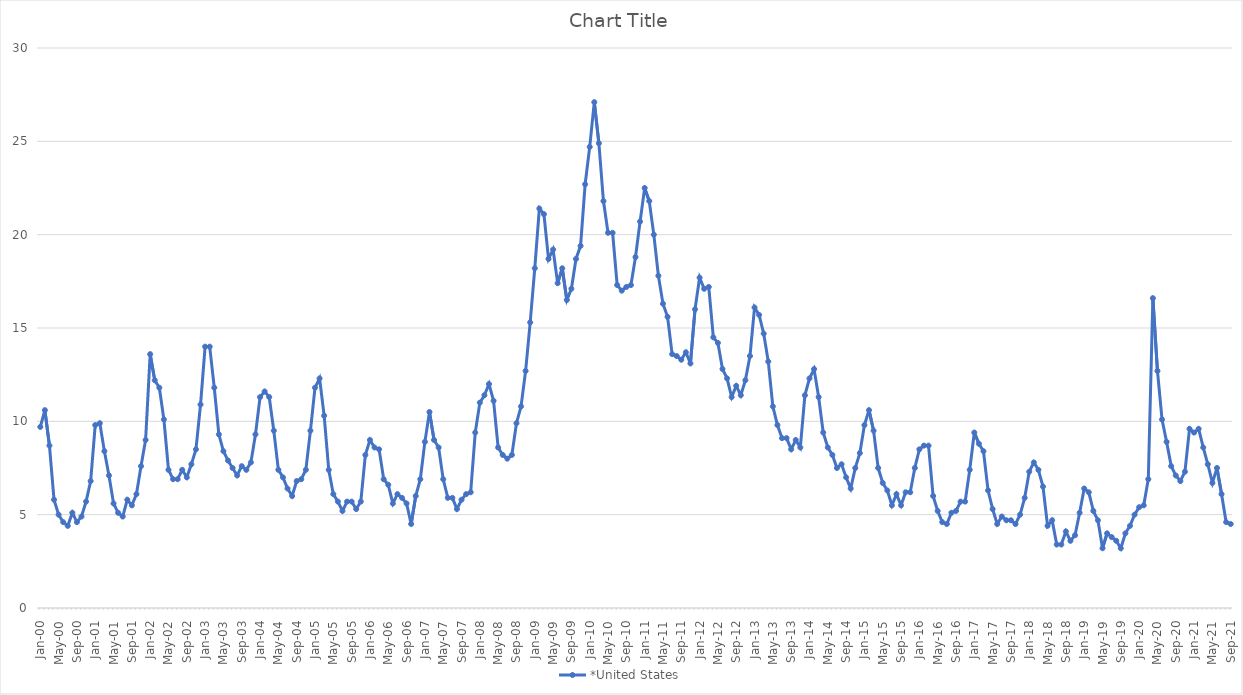
| Category | *United States | Alaska | Alabama | Arkansas | Arizona | California | Colorado | Connecticut | Delaware | Florida | Georgia | Hawaii | Iowa | Idaho | Illinois | Indiana | Kansas | Kentucky | Louisiana | Massachusetts | Maryland | Maine | Michigan | Minnesota | Missouri | Mississippi | Montana | North Carolina | North Dakota | Nebraska | New Hampshire | New Jersey | New Mexico | Nevada | New York | Ohio | Oklahoma | Oregon | Pennsylvania | Rhode Island | South Carolina | South Dakota | Tennessee | Texas | Utah | Virginia | Vermont | Washington | Wisconsin | West Virginia | Wyoming |
|---|---|---|---|---|---|---|---|---|---|---|---|---|---|---|---|---|---|---|---|---|---|---|---|---|---|---|---|---|---|---|---|---|---|---|---|---|---|---|---|---|---|---|---|---|---|---|---|---|---|---|---|
| Jan-00 | 9.7 |  |  |  |  |  |  |  |  |  |  |  |  |  |  |  |  |  |  |  |  |  |  |  |  |  |  |  |  |  |  |  |  |  |  |  |  |  |  |  |  |  |  |  |  |  |  |  |  |  |  |
| Feb-00 | 10.6 |  |  |  |  |  |  |  |  |  |  |  |  |  |  |  |  |  |  |  |  |  |  |  |  |  |  |  |  |  |  |  |  |  |  |  |  |  |  |  |  |  |  |  |  |  |  |  |  |  |  |
| Mar-00 | 8.7 |  |  |  |  |  |  |  |  |  |  |  |  |  |  |  |  |  |  |  |  |  |  |  |  |  |  |  |  |  |  |  |  |  |  |  |  |  |  |  |  |  |  |  |  |  |  |  |  |  |  |
| Apr-00 | 5.8 |  |  |  |  |  |  |  |  |  |  |  |  |  |  |  |  |  |  |  |  |  |  |  |  |  |  |  |  |  |  |  |  |  |  |  |  |  |  |  |  |  |  |  |  |  |  |  |  |  |  |
| May-00 | 5 |  |  |  |  |  |  |  |  |  |  |  |  |  |  |  |  |  |  |  |  |  |  |  |  |  |  |  |  |  |  |  |  |  |  |  |  |  |  |  |  |  |  |  |  |  |  |  |  |  |  |
| Jun-00 | 4.6 |  |  |  |  |  |  |  |  |  |  |  |  |  |  |  |  |  |  |  |  |  |  |  |  |  |  |  |  |  |  |  |  |  |  |  |  |  |  |  |  |  |  |  |  |  |  |  |  |  |  |
| Jul-00 | 4.4 |  |  |  |  |  |  |  |  |  |  |  |  |  |  |  |  |  |  |  |  |  |  |  |  |  |  |  |  |  |  |  |  |  |  |  |  |  |  |  |  |  |  |  |  |  |  |  |  |  |  |
| Aug-00 | 5.1 |  |  |  |  |  |  |  |  |  |  |  |  |  |  |  |  |  |  |  |  |  |  |  |  |  |  |  |  |  |  |  |  |  |  |  |  |  |  |  |  |  |  |  |  |  |  |  |  |  |  |
| Sep-00 | 4.6 |  |  |  |  |  |  |  |  |  |  |  |  |  |  |  |  |  |  |  |  |  |  |  |  |  |  |  |  |  |  |  |  |  |  |  |  |  |  |  |  |  |  |  |  |  |  |  |  |  |  |
| Oct-00 | 4.9 |  |  |  |  |  |  |  |  |  |  |  |  |  |  |  |  |  |  |  |  |  |  |  |  |  |  |  |  |  |  |  |  |  |  |  |  |  |  |  |  |  |  |  |  |  |  |  |  |  |  |
| Nov-00 | 5.7 |  |  |  |  |  |  |  |  |  |  |  |  |  |  |  |  |  |  |  |  |  |  |  |  |  |  |  |  |  |  |  |  |  |  |  |  |  |  |  |  |  |  |  |  |  |  |  |  |  |  |
| Dec-00 | 6.8 |  |  |  |  |  |  |  |  |  |  |  |  |  |  |  |  |  |  |  |  |  |  |  |  |  |  |  |  |  |  |  |  |  |  |  |  |  |  |  |  |  |  |  |  |  |  |  |  |  |  |
| Jan-01 | 9.8 |  |  |  |  |  |  |  |  |  |  |  |  |  |  |  |  |  |  |  |  |  |  |  |  |  |  |  |  |  |  |  |  |  |  |  |  |  |  |  |  |  |  |  |  |  |  |  |  |  |  |
| Feb-01 | 9.9 |  |  |  |  |  |  |  |  |  |  |  |  |  |  |  |  |  |  |  |  |  |  |  |  |  |  |  |  |  |  |  |  |  |  |  |  |  |  |  |  |  |  |  |  |  |  |  |  |  |  |
| Mar-01 | 8.4 |  |  |  |  |  |  |  |  |  |  |  |  |  |  |  |  |  |  |  |  |  |  |  |  |  |  |  |  |  |  |  |  |  |  |  |  |  |  |  |  |  |  |  |  |  |  |  |  |  |  |
| Apr-01 | 7.1 |  |  |  |  |  |  |  |  |  |  |  |  |  |  |  |  |  |  |  |  |  |  |  |  |  |  |  |  |  |  |  |  |  |  |  |  |  |  |  |  |  |  |  |  |  |  |  |  |  |  |
| May-01 | 5.6 |  |  |  |  |  |  |  |  |  |  |  |  |  |  |  |  |  |  |  |  |  |  |  |  |  |  |  |  |  |  |  |  |  |  |  |  |  |  |  |  |  |  |  |  |  |  |  |  |  |  |
| Jun-01 | 5.1 |  |  |  |  |  |  |  |  |  |  |  |  |  |  |  |  |  |  |  |  |  |  |  |  |  |  |  |  |  |  |  |  |  |  |  |  |  |  |  |  |  |  |  |  |  |  |  |  |  |  |
| Jul-01 | 4.9 |  |  |  |  |  |  |  |  |  |  |  |  |  |  |  |  |  |  |  |  |  |  |  |  |  |  |  |  |  |  |  |  |  |  |  |  |  |  |  |  |  |  |  |  |  |  |  |  |  |  |
| Aug-01 | 5.8 |  |  |  |  |  |  |  |  |  |  |  |  |  |  |  |  |  |  |  |  |  |  |  |  |  |  |  |  |  |  |  |  |  |  |  |  |  |  |  |  |  |  |  |  |  |  |  |  |  |  |
| Sep-01 | 5.5 |  |  |  |  |  |  |  |  |  |  |  |  |  |  |  |  |  |  |  |  |  |  |  |  |  |  |  |  |  |  |  |  |  |  |  |  |  |  |  |  |  |  |  |  |  |  |  |  |  |  |
| Oct-01 | 6.1 |  |  |  |  |  |  |  |  |  |  |  |  |  |  |  |  |  |  |  |  |  |  |  |  |  |  |  |  |  |  |  |  |  |  |  |  |  |  |  |  |  |  |  |  |  |  |  |  |  |  |
| Nov-01 | 7.6 |  |  |  |  |  |  |  |  |  |  |  |  |  |  |  |  |  |  |  |  |  |  |  |  |  |  |  |  |  |  |  |  |  |  |  |  |  |  |  |  |  |  |  |  |  |  |  |  |  |  |
| Dec-01 | 9 |  |  |  |  |  |  |  |  |  |  |  |  |  |  |  |  |  |  |  |  |  |  |  |  |  |  |  |  |  |  |  |  |  |  |  |  |  |  |  |  |  |  |  |  |  |  |  |  |  |  |
| Jan-02 | 13.6 |  |  |  |  |  |  |  |  |  |  |  |  |  |  |  |  |  |  |  |  |  |  |  |  |  |  |  |  |  |  |  |  |  |  |  |  |  |  |  |  |  |  |  |  |  |  |  |  |  |  |
| Feb-02 | 12.2 |  |  |  |  |  |  |  |  |  |  |  |  |  |  |  |  |  |  |  |  |  |  |  |  |  |  |  |  |  |  |  |  |  |  |  |  |  |  |  |  |  |  |  |  |  |  |  |  |  |  |
| Mar-02 | 11.8 |  |  |  |  |  |  |  |  |  |  |  |  |  |  |  |  |  |  |  |  |  |  |  |  |  |  |  |  |  |  |  |  |  |  |  |  |  |  |  |  |  |  |  |  |  |  |  |  |  |  |
| Apr-02 | 10.1 |  |  |  |  |  |  |  |  |  |  |  |  |  |  |  |  |  |  |  |  |  |  |  |  |  |  |  |  |  |  |  |  |  |  |  |  |  |  |  |  |  |  |  |  |  |  |  |  |  |  |
| May-02 | 7.4 |  |  |  |  |  |  |  |  |  |  |  |  |  |  |  |  |  |  |  |  |  |  |  |  |  |  |  |  |  |  |  |  |  |  |  |  |  |  |  |  |  |  |  |  |  |  |  |  |  |  |
| Jun-02 | 6.9 |  |  |  |  |  |  |  |  |  |  |  |  |  |  |  |  |  |  |  |  |  |  |  |  |  |  |  |  |  |  |  |  |  |  |  |  |  |  |  |  |  |  |  |  |  |  |  |  |  |  |
| Jul-02 | 6.9 |  |  |  |  |  |  |  |  |  |  |  |  |  |  |  |  |  |  |  |  |  |  |  |  |  |  |  |  |  |  |  |  |  |  |  |  |  |  |  |  |  |  |  |  |  |  |  |  |  |  |
| Aug-02 | 7.4 |  |  |  |  |  |  |  |  |  |  |  |  |  |  |  |  |  |  |  |  |  |  |  |  |  |  |  |  |  |  |  |  |  |  |  |  |  |  |  |  |  |  |  |  |  |  |  |  |  |  |
| Sep-02 | 7 |  |  |  |  |  |  |  |  |  |  |  |  |  |  |  |  |  |  |  |  |  |  |  |  |  |  |  |  |  |  |  |  |  |  |  |  |  |  |  |  |  |  |  |  |  |  |  |  |  |  |
| Oct-02 | 7.7 |  |  |  |  |  |  |  |  |  |  |  |  |  |  |  |  |  |  |  |  |  |  |  |  |  |  |  |  |  |  |  |  |  |  |  |  |  |  |  |  |  |  |  |  |  |  |  |  |  |  |
| Nov-02 | 8.5 |  |  |  |  |  |  |  |  |  |  |  |  |  |  |  |  |  |  |  |  |  |  |  |  |  |  |  |  |  |  |  |  |  |  |  |  |  |  |  |  |  |  |  |  |  |  |  |  |  |  |
| Dec-02 | 10.9 |  |  |  |  |  |  |  |  |  |  |  |  |  |  |  |  |  |  |  |  |  |  |  |  |  |  |  |  |  |  |  |  |  |  |  |  |  |  |  |  |  |  |  |  |  |  |  |  |  |  |
| Jan-03 | 14 |  |  |  |  |  |  |  |  |  |  |  |  |  |  |  |  |  |  |  |  |  |  |  |  |  |  |  |  |  |  |  |  |  |  |  |  |  |  |  |  |  |  |  |  |  |  |  |  |  |  |
| Feb-03 | 14 |  |  |  |  |  |  |  |  |  |  |  |  |  |  |  |  |  |  |  |  |  |  |  |  |  |  |  |  |  |  |  |  |  |  |  |  |  |  |  |  |  |  |  |  |  |  |  |  |  |  |
| Mar-03 | 11.8 |  |  |  |  |  |  |  |  |  |  |  |  |  |  |  |  |  |  |  |  |  |  |  |  |  |  |  |  |  |  |  |  |  |  |  |  |  |  |  |  |  |  |  |  |  |  |  |  |  |  |
| Apr-03 | 9.3 |  |  |  |  |  |  |  |  |  |  |  |  |  |  |  |  |  |  |  |  |  |  |  |  |  |  |  |  |  |  |  |  |  |  |  |  |  |  |  |  |  |  |  |  |  |  |  |  |  |  |
| May-03 | 8.4 |  |  |  |  |  |  |  |  |  |  |  |  |  |  |  |  |  |  |  |  |  |  |  |  |  |  |  |  |  |  |  |  |  |  |  |  |  |  |  |  |  |  |  |  |  |  |  |  |  |  |
| Jun-03 | 7.9 |  |  |  |  |  |  |  |  |  |  |  |  |  |  |  |  |  |  |  |  |  |  |  |  |  |  |  |  |  |  |  |  |  |  |  |  |  |  |  |  |  |  |  |  |  |  |  |  |  |  |
| Jul-03 | 7.5 |  |  |  |  |  |  |  |  |  |  |  |  |  |  |  |  |  |  |  |  |  |  |  |  |  |  |  |  |  |  |  |  |  |  |  |  |  |  |  |  |  |  |  |  |  |  |  |  |  |  |
| Aug-03 | 7.1 |  |  |  |  |  |  |  |  |  |  |  |  |  |  |  |  |  |  |  |  |  |  |  |  |  |  |  |  |  |  |  |  |  |  |  |  |  |  |  |  |  |  |  |  |  |  |  |  |  |  |
| Sep-03 | 7.6 |  |  |  |  |  |  |  |  |  |  |  |  |  |  |  |  |  |  |  |  |  |  |  |  |  |  |  |  |  |  |  |  |  |  |  |  |  |  |  |  |  |  |  |  |  |  |  |  |  |  |
| Oct-03 | 7.4 |  |  |  |  |  |  |  |  |  |  |  |  |  |  |  |  |  |  |  |  |  |  |  |  |  |  |  |  |  |  |  |  |  |  |  |  |  |  |  |  |  |  |  |  |  |  |  |  |  |  |
| Nov-03 | 7.8 |  |  |  |  |  |  |  |  |  |  |  |  |  |  |  |  |  |  |  |  |  |  |  |  |  |  |  |  |  |  |  |  |  |  |  |  |  |  |  |  |  |  |  |  |  |  |  |  |  |  |
| Dec-03 | 9.3 |  |  |  |  |  |  |  |  |  |  |  |  |  |  |  |  |  |  |  |  |  |  |  |  |  |  |  |  |  |  |  |  |  |  |  |  |  |  |  |  |  |  |  |  |  |  |  |  |  |  |
| Jan-04 | 11.3 |  |  |  |  |  |  |  |  |  |  |  |  |  |  |  |  |  |  |  |  |  |  |  |  |  |  |  |  |  |  |  |  |  |  |  |  |  |  |  |  |  |  |  |  |  |  |  |  |  |  |
| Feb-04 | 11.6 |  |  |  |  |  |  |  |  |  |  |  |  |  |  |  |  |  |  |  |  |  |  |  |  |  |  |  |  |  |  |  |  |  |  |  |  |  |  |  |  |  |  |  |  |  |  |  |  |  |  |
| Mar-04 | 11.3 |  |  |  |  |  |  |  |  |  |  |  |  |  |  |  |  |  |  |  |  |  |  |  |  |  |  |  |  |  |  |  |  |  |  |  |  |  |  |  |  |  |  |  |  |  |  |  |  |  |  |
| Apr-04 | 9.5 |  |  |  |  |  |  |  |  |  |  |  |  |  |  |  |  |  |  |  |  |  |  |  |  |  |  |  |  |  |  |  |  |  |  |  |  |  |  |  |  |  |  |  |  |  |  |  |  |  |  |
| May-04 | 7.4 |  |  |  |  |  |  |  |  |  |  |  |  |  |  |  |  |  |  |  |  |  |  |  |  |  |  |  |  |  |  |  |  |  |  |  |  |  |  |  |  |  |  |  |  |  |  |  |  |  |  |
| Jun-04 | 7 |  |  |  |  |  |  |  |  |  |  |  |  |  |  |  |  |  |  |  |  |  |  |  |  |  |  |  |  |  |  |  |  |  |  |  |  |  |  |  |  |  |  |  |  |  |  |  |  |  |  |
| Jul-04 | 6.4 |  |  |  |  |  |  |  |  |  |  |  |  |  |  |  |  |  |  |  |  |  |  |  |  |  |  |  |  |  |  |  |  |  |  |  |  |  |  |  |  |  |  |  |  |  |  |  |  |  |  |
| Aug-04 | 6 |  |  |  |  |  |  |  |  |  |  |  |  |  |  |  |  |  |  |  |  |  |  |  |  |  |  |  |  |  |  |  |  |  |  |  |  |  |  |  |  |  |  |  |  |  |  |  |  |  |  |
| Sep-04 | 6.8 |  |  |  |  |  |  |  |  |  |  |  |  |  |  |  |  |  |  |  |  |  |  |  |  |  |  |  |  |  |  |  |  |  |  |  |  |  |  |  |  |  |  |  |  |  |  |  |  |  |  |
| Oct-04 | 6.9 |  |  |  |  |  |  |  |  |  |  |  |  |  |  |  |  |  |  |  |  |  |  |  |  |  |  |  |  |  |  |  |  |  |  |  |  |  |  |  |  |  |  |  |  |  |  |  |  |  |  |
| Nov-04 | 7.4 |  |  |  |  |  |  |  |  |  |  |  |  |  |  |  |  |  |  |  |  |  |  |  |  |  |  |  |  |  |  |  |  |  |  |  |  |  |  |  |  |  |  |  |  |  |  |  |  |  |  |
| Dec-04 | 9.5 |  |  |  |  |  |  |  |  |  |  |  |  |  |  |  |  |  |  |  |  |  |  |  |  |  |  |  |  |  |  |  |  |  |  |  |  |  |  |  |  |  |  |  |  |  |  |  |  |  |  |
| Jan-05 | 11.8 |  |  |  |  |  |  |  |  |  |  |  |  |  |  |  |  |  |  |  |  |  |  |  |  |  |  |  |  |  |  |  |  |  |  |  |  |  |  |  |  |  |  |  |  |  |  |  |  |  |  |
| Feb-05 | 12.3 |  |  |  |  |  |  |  |  |  |  |  |  |  |  |  |  |  |  |  |  |  |  |  |  |  |  |  |  |  |  |  |  |  |  |  |  |  |  |  |  |  |  |  |  |  |  |  |  |  |  |
| Mar-05 | 10.3 |  |  |  |  |  |  |  |  |  |  |  |  |  |  |  |  |  |  |  |  |  |  |  |  |  |  |  |  |  |  |  |  |  |  |  |  |  |  |  |  |  |  |  |  |  |  |  |  |  |  |
| Apr-05 | 7.4 |  |  |  |  |  |  |  |  |  |  |  |  |  |  |  |  |  |  |  |  |  |  |  |  |  |  |  |  |  |  |  |  |  |  |  |  |  |  |  |  |  |  |  |  |  |  |  |  |  |  |
| May-05 | 6.1 |  |  |  |  |  |  |  |  |  |  |  |  |  |  |  |  |  |  |  |  |  |  |  |  |  |  |  |  |  |  |  |  |  |  |  |  |  |  |  |  |  |  |  |  |  |  |  |  |  |  |
| Jun-05 | 5.7 |  |  |  |  |  |  |  |  |  |  |  |  |  |  |  |  |  |  |  |  |  |  |  |  |  |  |  |  |  |  |  |  |  |  |  |  |  |  |  |  |  |  |  |  |  |  |  |  |  |  |
| Jul-05 | 5.2 |  |  |  |  |  |  |  |  |  |  |  |  |  |  |  |  |  |  |  |  |  |  |  |  |  |  |  |  |  |  |  |  |  |  |  |  |  |  |  |  |  |  |  |  |  |  |  |  |  |  |
| Aug-05 | 5.7 |  |  |  |  |  |  |  |  |  |  |  |  |  |  |  |  |  |  |  |  |  |  |  |  |  |  |  |  |  |  |  |  |  |  |  |  |  |  |  |  |  |  |  |  |  |  |  |  |  |  |
| Sep-05 | 5.7 |  |  |  |  |  |  |  |  |  |  |  |  |  |  |  |  |  |  |  |  |  |  |  |  |  |  |  |  |  |  |  |  |  |  |  |  |  |  |  |  |  |  |  |  |  |  |  |  |  |  |
| Oct-05 | 5.3 |  |  |  |  |  |  |  |  |  |  |  |  |  |  |  |  |  |  |  |  |  |  |  |  |  |  |  |  |  |  |  |  |  |  |  |  |  |  |  |  |  |  |  |  |  |  |  |  |  |  |
| Nov-05 | 5.7 |  |  |  |  |  |  |  |  |  |  |  |  |  |  |  |  |  |  |  |  |  |  |  |  |  |  |  |  |  |  |  |  |  |  |  |  |  |  |  |  |  |  |  |  |  |  |  |  |  |  |
| Dec-05 | 8.2 |  |  |  |  |  |  |  |  |  |  |  |  |  |  |  |  |  |  |  |  |  |  |  |  |  |  |  |  |  |  |  |  |  |  |  |  |  |  |  |  |  |  |  |  |  |  |  |  |  |  |
| Jan-06 | 9 |  |  |  |  |  |  |  |  |  |  |  |  |  |  |  |  |  |  |  |  |  |  |  |  |  |  |  |  |  |  |  |  |  |  |  |  |  |  |  |  |  |  |  |  |  |  |  |  |  |  |
| Feb-06 | 8.6 |  |  |  |  |  |  |  |  |  |  |  |  |  |  |  |  |  |  |  |  |  |  |  |  |  |  |  |  |  |  |  |  |  |  |  |  |  |  |  |  |  |  |  |  |  |  |  |  |  |  |
| Mar-06 | 8.5 |  |  |  |  |  |  |  |  |  |  |  |  |  |  |  |  |  |  |  |  |  |  |  |  |  |  |  |  |  |  |  |  |  |  |  |  |  |  |  |  |  |  |  |  |  |  |  |  |  |  |
| Apr-06 | 6.9 |  |  |  |  |  |  |  |  |  |  |  |  |  |  |  |  |  |  |  |  |  |  |  |  |  |  |  |  |  |  |  |  |  |  |  |  |  |  |  |  |  |  |  |  |  |  |  |  |  |  |
| May-06 | 6.6 |  |  |  |  |  |  |  |  |  |  |  |  |  |  |  |  |  |  |  |  |  |  |  |  |  |  |  |  |  |  |  |  |  |  |  |  |  |  |  |  |  |  |  |  |  |  |  |  |  |  |
| Jun-06 | 5.6 |  |  |  |  |  |  |  |  |  |  |  |  |  |  |  |  |  |  |  |  |  |  |  |  |  |  |  |  |  |  |  |  |  |  |  |  |  |  |  |  |  |  |  |  |  |  |  |  |  |  |
| Jul-06 | 6.1 |  |  |  |  |  |  |  |  |  |  |  |  |  |  |  |  |  |  |  |  |  |  |  |  |  |  |  |  |  |  |  |  |  |  |  |  |  |  |  |  |  |  |  |  |  |  |  |  |  |  |
| Aug-06 | 5.9 |  |  |  |  |  |  |  |  |  |  |  |  |  |  |  |  |  |  |  |  |  |  |  |  |  |  |  |  |  |  |  |  |  |  |  |  |  |  |  |  |  |  |  |  |  |  |  |  |  |  |
| Sep-06 | 5.6 |  |  |  |  |  |  |  |  |  |  |  |  |  |  |  |  |  |  |  |  |  |  |  |  |  |  |  |  |  |  |  |  |  |  |  |  |  |  |  |  |  |  |  |  |  |  |  |  |  |  |
| Oct-06 | 4.5 |  |  |  |  |  |  |  |  |  |  |  |  |  |  |  |  |  |  |  |  |  |  |  |  |  |  |  |  |  |  |  |  |  |  |  |  |  |  |  |  |  |  |  |  |  |  |  |  |  |  |
| Nov-06 | 6 |  |  |  |  |  |  |  |  |  |  |  |  |  |  |  |  |  |  |  |  |  |  |  |  |  |  |  |  |  |  |  |  |  |  |  |  |  |  |  |  |  |  |  |  |  |  |  |  |  |  |
| Dec-06 | 6.9 |  |  |  |  |  |  |  |  |  |  |  |  |  |  |  |  |  |  |  |  |  |  |  |  |  |  |  |  |  |  |  |  |  |  |  |  |  |  |  |  |  |  |  |  |  |  |  |  |  |  |
| Jan-07 | 8.9 |  |  |  |  |  |  |  |  |  |  |  |  |  |  |  |  |  |  |  |  |  |  |  |  |  |  |  |  |  |  |  |  |  |  |  |  |  |  |  |  |  |  |  |  |  |  |  |  |  |  |
| Feb-07 | 10.5 |  |  |  |  |  |  |  |  |  |  |  |  |  |  |  |  |  |  |  |  |  |  |  |  |  |  |  |  |  |  |  |  |  |  |  |  |  |  |  |  |  |  |  |  |  |  |  |  |  |  |
| Mar-07 | 9 |  |  |  |  |  |  |  |  |  |  |  |  |  |  |  |  |  |  |  |  |  |  |  |  |  |  |  |  |  |  |  |  |  |  |  |  |  |  |  |  |  |  |  |  |  |  |  |  |  |  |
| Apr-07 | 8.6 |  |  |  |  |  |  |  |  |  |  |  |  |  |  |  |  |  |  |  |  |  |  |  |  |  |  |  |  |  |  |  |  |  |  |  |  |  |  |  |  |  |  |  |  |  |  |  |  |  |  |
| May-07 | 6.9 |  |  |  |  |  |  |  |  |  |  |  |  |  |  |  |  |  |  |  |  |  |  |  |  |  |  |  |  |  |  |  |  |  |  |  |  |  |  |  |  |  |  |  |  |  |  |  |  |  |  |
| Jun-07 | 5.9 |  |  |  |  |  |  |  |  |  |  |  |  |  |  |  |  |  |  |  |  |  |  |  |  |  |  |  |  |  |  |  |  |  |  |  |  |  |  |  |  |  |  |  |  |  |  |  |  |  |  |
| Jul-07 | 5.9 |  |  |  |  |  |  |  |  |  |  |  |  |  |  |  |  |  |  |  |  |  |  |  |  |  |  |  |  |  |  |  |  |  |  |  |  |  |  |  |  |  |  |  |  |  |  |  |  |  |  |
| Aug-07 | 5.3 |  |  |  |  |  |  |  |  |  |  |  |  |  |  |  |  |  |  |  |  |  |  |  |  |  |  |  |  |  |  |  |  |  |  |  |  |  |  |  |  |  |  |  |  |  |  |  |  |  |  |
| Sep-07 | 5.8 |  |  |  |  |  |  |  |  |  |  |  |  |  |  |  |  |  |  |  |  |  |  |  |  |  |  |  |  |  |  |  |  |  |  |  |  |  |  |  |  |  |  |  |  |  |  |  |  |  |  |
| Oct-07 | 6.1 |  |  |  |  |  |  |  |  |  |  |  |  |  |  |  |  |  |  |  |  |  |  |  |  |  |  |  |  |  |  |  |  |  |  |  |  |  |  |  |  |  |  |  |  |  |  |  |  |  |  |
| Nov-07 | 6.2 |  |  |  |  |  |  |  |  |  |  |  |  |  |  |  |  |  |  |  |  |  |  |  |  |  |  |  |  |  |  |  |  |  |  |  |  |  |  |  |  |  |  |  |  |  |  |  |  |  |  |
| Dec-07 | 9.4 |  |  |  |  |  |  |  |  |  |  |  |  |  |  |  |  |  |  |  |  |  |  |  |  |  |  |  |  |  |  |  |  |  |  |  |  |  |  |  |  |  |  |  |  |  |  |  |  |  |  |
| Jan-08 | 11 |  |  |  |  |  |  |  |  |  |  |  |  |  |  |  |  |  |  |  |  |  |  |  |  |  |  |  |  |  |  |  |  |  |  |  |  |  |  |  |  |  |  |  |  |  |  |  |  |  |  |
| Feb-08 | 11.4 |  |  |  |  |  |  |  |  |  |  |  |  |  |  |  |  |  |  |  |  |  |  |  |  |  |  |  |  |  |  |  |  |  |  |  |  |  |  |  |  |  |  |  |  |  |  |  |  |  |  |
| Mar-08 | 12 |  |  |  |  |  |  |  |  |  |  |  |  |  |  |  |  |  |  |  |  |  |  |  |  |  |  |  |  |  |  |  |  |  |  |  |  |  |  |  |  |  |  |  |  |  |  |  |  |  |  |
| Apr-08 | 11.1 |  |  |  |  |  |  |  |  |  |  |  |  |  |  |  |  |  |  |  |  |  |  |  |  |  |  |  |  |  |  |  |  |  |  |  |  |  |  |  |  |  |  |  |  |  |  |  |  |  |  |
| May-08 | 8.6 |  |  |  |  |  |  |  |  |  |  |  |  |  |  |  |  |  |  |  |  |  |  |  |  |  |  |  |  |  |  |  |  |  |  |  |  |  |  |  |  |  |  |  |  |  |  |  |  |  |  |
| Jun-08 | 8.2 |  |  |  |  |  |  |  |  |  |  |  |  |  |  |  |  |  |  |  |  |  |  |  |  |  |  |  |  |  |  |  |  |  |  |  |  |  |  |  |  |  |  |  |  |  |  |  |  |  |  |
| Jul-08 | 8 |  |  |  |  |  |  |  |  |  |  |  |  |  |  |  |  |  |  |  |  |  |  |  |  |  |  |  |  |  |  |  |  |  |  |  |  |  |  |  |  |  |  |  |  |  |  |  |  |  |  |
| Aug-08 | 8.2 |  |  |  |  |  |  |  |  |  |  |  |  |  |  |  |  |  |  |  |  |  |  |  |  |  |  |  |  |  |  |  |  |  |  |  |  |  |  |  |  |  |  |  |  |  |  |  |  |  |  |
| Sep-08 | 9.9 |  |  |  |  |  |  |  |  |  |  |  |  |  |  |  |  |  |  |  |  |  |  |  |  |  |  |  |  |  |  |  |  |  |  |  |  |  |  |  |  |  |  |  |  |  |  |  |  |  |  |
| Oct-08 | 10.8 |  |  |  |  |  |  |  |  |  |  |  |  |  |  |  |  |  |  |  |  |  |  |  |  |  |  |  |  |  |  |  |  |  |  |  |  |  |  |  |  |  |  |  |  |  |  |  |  |  |  |
| Nov-08 | 12.7 |  |  |  |  |  |  |  |  |  |  |  |  |  |  |  |  |  |  |  |  |  |  |  |  |  |  |  |  |  |  |  |  |  |  |  |  |  |  |  |  |  |  |  |  |  |  |  |  |  |  |
| Dec-08 | 15.3 |  |  |  |  |  |  |  |  |  |  |  |  |  |  |  |  |  |  |  |  |  |  |  |  |  |  |  |  |  |  |  |  |  |  |  |  |  |  |  |  |  |  |  |  |  |  |  |  |  |  |
| Jan-09 | 18.2 |  |  |  |  |  |  |  |  |  |  |  |  |  |  |  |  |  |  |  |  |  |  |  |  |  |  |  |  |  |  |  |  |  |  |  |  |  |  |  |  |  |  |  |  |  |  |  |  |  |  |
| Feb-09 | 21.4 |  |  |  |  |  |  |  |  |  |  |  |  |  |  |  |  |  |  |  |  |  |  |  |  |  |  |  |  |  |  |  |  |  |  |  |  |  |  |  |  |  |  |  |  |  |  |  |  |  |  |
| Mar-09 | 21.1 |  |  |  |  |  |  |  |  |  |  |  |  |  |  |  |  |  |  |  |  |  |  |  |  |  |  |  |  |  |  |  |  |  |  |  |  |  |  |  |  |  |  |  |  |  |  |  |  |  |  |
| Apr-09 | 18.7 |  |  |  |  |  |  |  |  |  |  |  |  |  |  |  |  |  |  |  |  |  |  |  |  |  |  |  |  |  |  |  |  |  |  |  |  |  |  |  |  |  |  |  |  |  |  |  |  |  |  |
| May-09 | 19.2 |  |  |  |  |  |  |  |  |  |  |  |  |  |  |  |  |  |  |  |  |  |  |  |  |  |  |  |  |  |  |  |  |  |  |  |  |  |  |  |  |  |  |  |  |  |  |  |  |  |  |
| Jun-09 | 17.4 |  |  |  |  |  |  |  |  |  |  |  |  |  |  |  |  |  |  |  |  |  |  |  |  |  |  |  |  |  |  |  |  |  |  |  |  |  |  |  |  |  |  |  |  |  |  |  |  |  |  |
| Jul-09 | 18.2 |  |  |  |  |  |  |  |  |  |  |  |  |  |  |  |  |  |  |  |  |  |  |  |  |  |  |  |  |  |  |  |  |  |  |  |  |  |  |  |  |  |  |  |  |  |  |  |  |  |  |
| Aug-09 | 16.5 |  |  |  |  |  |  |  |  |  |  |  |  |  |  |  |  |  |  |  |  |  |  |  |  |  |  |  |  |  |  |  |  |  |  |  |  |  |  |  |  |  |  |  |  |  |  |  |  |  |  |
| Sep-09 | 17.1 |  |  |  |  |  |  |  |  |  |  |  |  |  |  |  |  |  |  |  |  |  |  |  |  |  |  |  |  |  |  |  |  |  |  |  |  |  |  |  |  |  |  |  |  |  |  |  |  |  |  |
| Oct-09 | 18.7 |  |  |  |  |  |  |  |  |  |  |  |  |  |  |  |  |  |  |  |  |  |  |  |  |  |  |  |  |  |  |  |  |  |  |  |  |  |  |  |  |  |  |  |  |  |  |  |  |  |  |
| Nov-09 | 19.4 |  |  |  |  |  |  |  |  |  |  |  |  |  |  |  |  |  |  |  |  |  |  |  |  |  |  |  |  |  |  |  |  |  |  |  |  |  |  |  |  |  |  |  |  |  |  |  |  |  |  |
| Dec-09 | 22.7 |  |  |  |  |  |  |  |  |  |  |  |  |  |  |  |  |  |  |  |  |  |  |  |  |  |  |  |  |  |  |  |  |  |  |  |  |  |  |  |  |  |  |  |  |  |  |  |  |  |  |
| Jan-10 | 24.7 |  |  |  |  |  |  |  |  |  |  |  |  |  |  |  |  |  |  |  |  |  |  |  |  |  |  |  |  |  |  |  |  |  |  |  |  |  |  |  |  |  |  |  |  |  |  |  |  |  |  |
| Feb-10 | 27.1 |  |  |  |  |  |  |  |  |  |  |  |  |  |  |  |  |  |  |  |  |  |  |  |  |  |  |  |  |  |  |  |  |  |  |  |  |  |  |  |  |  |  |  |  |  |  |  |  |  |  |
| Mar-10 | 24.9 |  |  |  |  |  |  |  |  |  |  |  |  |  |  |  |  |  |  |  |  |  |  |  |  |  |  |  |  |  |  |  |  |  |  |  |  |  |  |  |  |  |  |  |  |  |  |  |  |  |  |
| Apr-10 | 21.8 |  |  |  |  |  |  |  |  |  |  |  |  |  |  |  |  |  |  |  |  |  |  |  |  |  |  |  |  |  |  |  |  |  |  |  |  |  |  |  |  |  |  |  |  |  |  |  |  |  |  |
| May-10 | 20.1 |  |  |  |  |  |  |  |  |  |  |  |  |  |  |  |  |  |  |  |  |  |  |  |  |  |  |  |  |  |  |  |  |  |  |  |  |  |  |  |  |  |  |  |  |  |  |  |  |  |  |
| Jun-10 | 20.1 |  |  |  |  |  |  |  |  |  |  |  |  |  |  |  |  |  |  |  |  |  |  |  |  |  |  |  |  |  |  |  |  |  |  |  |  |  |  |  |  |  |  |  |  |  |  |  |  |  |  |
| Jul-10 | 17.3 |  |  |  |  |  |  |  |  |  |  |  |  |  |  |  |  |  |  |  |  |  |  |  |  |  |  |  |  |  |  |  |  |  |  |  |  |  |  |  |  |  |  |  |  |  |  |  |  |  |  |
| Aug-10 | 17 |  |  |  |  |  |  |  |  |  |  |  |  |  |  |  |  |  |  |  |  |  |  |  |  |  |  |  |  |  |  |  |  |  |  |  |  |  |  |  |  |  |  |  |  |  |  |  |  |  |  |
| Sep-10 | 17.2 |  |  |  |  |  |  |  |  |  |  |  |  |  |  |  |  |  |  |  |  |  |  |  |  |  |  |  |  |  |  |  |  |  |  |  |  |  |  |  |  |  |  |  |  |  |  |  |  |  |  |
| Oct-10 | 17.3 |  |  |  |  |  |  |  |  |  |  |  |  |  |  |  |  |  |  |  |  |  |  |  |  |  |  |  |  |  |  |  |  |  |  |  |  |  |  |  |  |  |  |  |  |  |  |  |  |  |  |
| Nov-10 | 18.8 |  |  |  |  |  |  |  |  |  |  |  |  |  |  |  |  |  |  |  |  |  |  |  |  |  |  |  |  |  |  |  |  |  |  |  |  |  |  |  |  |  |  |  |  |  |  |  |  |  |  |
| Dec-10 | 20.7 |  |  |  |  |  |  |  |  |  |  |  |  |  |  |  |  |  |  |  |  |  |  |  |  |  |  |  |  |  |  |  |  |  |  |  |  |  |  |  |  |  |  |  |  |  |  |  |  |  |  |
| Jan-11 | 22.5 |  |  |  |  |  |  |  |  |  |  |  |  |  |  |  |  |  |  |  |  |  |  |  |  |  |  |  |  |  |  |  |  |  |  |  |  |  |  |  |  |  |  |  |  |  |  |  |  |  |  |
| Feb-11 | 21.8 |  |  |  |  |  |  |  |  |  |  |  |  |  |  |  |  |  |  |  |  |  |  |  |  |  |  |  |  |  |  |  |  |  |  |  |  |  |  |  |  |  |  |  |  |  |  |  |  |  |  |
| Mar-11 | 20 |  |  |  |  |  |  |  |  |  |  |  |  |  |  |  |  |  |  |  |  |  |  |  |  |  |  |  |  |  |  |  |  |  |  |  |  |  |  |  |  |  |  |  |  |  |  |  |  |  |  |
| Apr-11 | 17.8 |  |  |  |  |  |  |  |  |  |  |  |  |  |  |  |  |  |  |  |  |  |  |  |  |  |  |  |  |  |  |  |  |  |  |  |  |  |  |  |  |  |  |  |  |  |  |  |  |  |  |
| May-11 | 16.3 |  |  |  |  |  |  |  |  |  |  |  |  |  |  |  |  |  |  |  |  |  |  |  |  |  |  |  |  |  |  |  |  |  |  |  |  |  |  |  |  |  |  |  |  |  |  |  |  |  |  |
| Jun-11 | 15.6 |  |  |  |  |  |  |  |  |  |  |  |  |  |  |  |  |  |  |  |  |  |  |  |  |  |  |  |  |  |  |  |  |  |  |  |  |  |  |  |  |  |  |  |  |  |  |  |  |  |  |
| Jul-11 | 13.6 |  |  |  |  |  |  |  |  |  |  |  |  |  |  |  |  |  |  |  |  |  |  |  |  |  |  |  |  |  |  |  |  |  |  |  |  |  |  |  |  |  |  |  |  |  |  |  |  |  |  |
| Aug-11 | 13.5 |  |  |  |  |  |  |  |  |  |  |  |  |  |  |  |  |  |  |  |  |  |  |  |  |  |  |  |  |  |  |  |  |  |  |  |  |  |  |  |  |  |  |  |  |  |  |  |  |  |  |
| Sep-11 | 13.3 |  |  |  |  |  |  |  |  |  |  |  |  |  |  |  |  |  |  |  |  |  |  |  |  |  |  |  |  |  |  |  |  |  |  |  |  |  |  |  |  |  |  |  |  |  |  |  |  |  |  |
| Oct-11 | 13.7 |  |  |  |  |  |  |  |  |  |  |  |  |  |  |  |  |  |  |  |  |  |  |  |  |  |  |  |  |  |  |  |  |  |  |  |  |  |  |  |  |  |  |  |  |  |  |  |  |  |  |
| Nov-11 | 13.1 |  |  |  |  |  |  |  |  |  |  |  |  |  |  |  |  |  |  |  |  |  |  |  |  |  |  |  |  |  |  |  |  |  |  |  |  |  |  |  |  |  |  |  |  |  |  |  |  |  |  |
| Dec-11 | 16 |  |  |  |  |  |  |  |  |  |  |  |  |  |  |  |  |  |  |  |  |  |  |  |  |  |  |  |  |  |  |  |  |  |  |  |  |  |  |  |  |  |  |  |  |  |  |  |  |  |  |
| Jan-12 | 17.7 |  |  |  |  |  |  |  |  |  |  |  |  |  |  |  |  |  |  |  |  |  |  |  |  |  |  |  |  |  |  |  |  |  |  |  |  |  |  |  |  |  |  |  |  |  |  |  |  |  |  |
| Feb-12 | 17.1 |  |  |  |  |  |  |  |  |  |  |  |  |  |  |  |  |  |  |  |  |  |  |  |  |  |  |  |  |  |  |  |  |  |  |  |  |  |  |  |  |  |  |  |  |  |  |  |  |  |  |
| Mar-12 | 17.2 |  |  |  |  |  |  |  |  |  |  |  |  |  |  |  |  |  |  |  |  |  |  |  |  |  |  |  |  |  |  |  |  |  |  |  |  |  |  |  |  |  |  |  |  |  |  |  |  |  |  |
| Apr-12 | 14.5 |  |  |  |  |  |  |  |  |  |  |  |  |  |  |  |  |  |  |  |  |  |  |  |  |  |  |  |  |  |  |  |  |  |  |  |  |  |  |  |  |  |  |  |  |  |  |  |  |  |  |
| May-12 | 14.2 |  |  |  |  |  |  |  |  |  |  |  |  |  |  |  |  |  |  |  |  |  |  |  |  |  |  |  |  |  |  |  |  |  |  |  |  |  |  |  |  |  |  |  |  |  |  |  |  |  |  |
| Jun-12 | 12.8 |  |  |  |  |  |  |  |  |  |  |  |  |  |  |  |  |  |  |  |  |  |  |  |  |  |  |  |  |  |  |  |  |  |  |  |  |  |  |  |  |  |  |  |  |  |  |  |  |  |  |
| Jul-12 | 12.3 |  |  |  |  |  |  |  |  |  |  |  |  |  |  |  |  |  |  |  |  |  |  |  |  |  |  |  |  |  |  |  |  |  |  |  |  |  |  |  |  |  |  |  |  |  |  |  |  |  |  |
| Aug-12 | 11.3 |  |  |  |  |  |  |  |  |  |  |  |  |  |  |  |  |  |  |  |  |  |  |  |  |  |  |  |  |  |  |  |  |  |  |  |  |  |  |  |  |  |  |  |  |  |  |  |  |  |  |
| Sep-12 | 11.9 |  |  |  |  |  |  |  |  |  |  |  |  |  |  |  |  |  |  |  |  |  |  |  |  |  |  |  |  |  |  |  |  |  |  |  |  |  |  |  |  |  |  |  |  |  |  |  |  |  |  |
| Oct-12 | 11.4 |  |  |  |  |  |  |  |  |  |  |  |  |  |  |  |  |  |  |  |  |  |  |  |  |  |  |  |  |  |  |  |  |  |  |  |  |  |  |  |  |  |  |  |  |  |  |  |  |  |  |
| Nov-12 | 12.2 |  |  |  |  |  |  |  |  |  |  |  |  |  |  |  |  |  |  |  |  |  |  |  |  |  |  |  |  |  |  |  |  |  |  |  |  |  |  |  |  |  |  |  |  |  |  |  |  |  |  |
| Dec-12 | 13.5 |  |  |  |  |  |  |  |  |  |  |  |  |  |  |  |  |  |  |  |  |  |  |  |  |  |  |  |  |  |  |  |  |  |  |  |  |  |  |  |  |  |  |  |  |  |  |  |  |  |  |
| Jan-13 | 16.1 |  |  |  |  |  |  |  |  |  |  |  |  |  |  |  |  |  |  |  |  |  |  |  |  |  |  |  |  |  |  |  |  |  |  |  |  |  |  |  |  |  |  |  |  |  |  |  |  |  |  |
| Feb-13 | 15.7 |  |  |  |  |  |  |  |  |  |  |  |  |  |  |  |  |  |  |  |  |  |  |  |  |  |  |  |  |  |  |  |  |  |  |  |  |  |  |  |  |  |  |  |  |  |  |  |  |  |  |
| Mar-13 | 14.7 |  |  |  |  |  |  |  |  |  |  |  |  |  |  |  |  |  |  |  |  |  |  |  |  |  |  |  |  |  |  |  |  |  |  |  |  |  |  |  |  |  |  |  |  |  |  |  |  |  |  |
| Apr-13 | 13.2 |  |  |  |  |  |  |  |  |  |  |  |  |  |  |  |  |  |  |  |  |  |  |  |  |  |  |  |  |  |  |  |  |  |  |  |  |  |  |  |  |  |  |  |  |  |  |  |  |  |  |
| May-13 | 10.8 |  |  |  |  |  |  |  |  |  |  |  |  |  |  |  |  |  |  |  |  |  |  |  |  |  |  |  |  |  |  |  |  |  |  |  |  |  |  |  |  |  |  |  |  |  |  |  |  |  |  |
| Jun-13 | 9.8 |  |  |  |  |  |  |  |  |  |  |  |  |  |  |  |  |  |  |  |  |  |  |  |  |  |  |  |  |  |  |  |  |  |  |  |  |  |  |  |  |  |  |  |  |  |  |  |  |  |  |
| Jul-13 | 9.1 |  |  |  |  |  |  |  |  |  |  |  |  |  |  |  |  |  |  |  |  |  |  |  |  |  |  |  |  |  |  |  |  |  |  |  |  |  |  |  |  |  |  |  |  |  |  |  |  |  |  |
| Aug-13 | 9.1 |  |  |  |  |  |  |  |  |  |  |  |  |  |  |  |  |  |  |  |  |  |  |  |  |  |  |  |  |  |  |  |  |  |  |  |  |  |  |  |  |  |  |  |  |  |  |  |  |  |  |
| Sep-13 | 8.5 |  |  |  |  |  |  |  |  |  |  |  |  |  |  |  |  |  |  |  |  |  |  |  |  |  |  |  |  |  |  |  |  |  |  |  |  |  |  |  |  |  |  |  |  |  |  |  |  |  |  |
| Oct-13 | 9 |  |  |  |  |  |  |  |  |  |  |  |  |  |  |  |  |  |  |  |  |  |  |  |  |  |  |  |  |  |  |  |  |  |  |  |  |  |  |  |  |  |  |  |  |  |  |  |  |  |  |
| Nov-13 | 8.6 |  |  |  |  |  |  |  |  |  |  |  |  |  |  |  |  |  |  |  |  |  |  |  |  |  |  |  |  |  |  |  |  |  |  |  |  |  |  |  |  |  |  |  |  |  |  |  |  |  |  |
| Dec-13 | 11.4 |  |  |  |  |  |  |  |  |  |  |  |  |  |  |  |  |  |  |  |  |  |  |  |  |  |  |  |  |  |  |  |  |  |  |  |  |  |  |  |  |  |  |  |  |  |  |  |  |  |  |
| Jan-14 | 12.3 |  |  |  |  |  |  |  |  |  |  |  |  |  |  |  |  |  |  |  |  |  |  |  |  |  |  |  |  |  |  |  |  |  |  |  |  |  |  |  |  |  |  |  |  |  |  |  |  |  |  |
| Feb-14 | 12.8 |  |  |  |  |  |  |  |  |  |  |  |  |  |  |  |  |  |  |  |  |  |  |  |  |  |  |  |  |  |  |  |  |  |  |  |  |  |  |  |  |  |  |  |  |  |  |  |  |  |  |
| Mar-14 | 11.3 |  |  |  |  |  |  |  |  |  |  |  |  |  |  |  |  |  |  |  |  |  |  |  |  |  |  |  |  |  |  |  |  |  |  |  |  |  |  |  |  |  |  |  |  |  |  |  |  |  |  |
| Apr-14 | 9.4 |  |  |  |  |  |  |  |  |  |  |  |  |  |  |  |  |  |  |  |  |  |  |  |  |  |  |  |  |  |  |  |  |  |  |  |  |  |  |  |  |  |  |  |  |  |  |  |  |  |  |
| May-14 | 8.6 |  |  |  |  |  |  |  |  |  |  |  |  |  |  |  |  |  |  |  |  |  |  |  |  |  |  |  |  |  |  |  |  |  |  |  |  |  |  |  |  |  |  |  |  |  |  |  |  |  |  |
| Jun-14 | 8.2 |  |  |  |  |  |  |  |  |  |  |  |  |  |  |  |  |  |  |  |  |  |  |  |  |  |  |  |  |  |  |  |  |  |  |  |  |  |  |  |  |  |  |  |  |  |  |  |  |  |  |
| Jul-14 | 7.5 |  |  |  |  |  |  |  |  |  |  |  |  |  |  |  |  |  |  |  |  |  |  |  |  |  |  |  |  |  |  |  |  |  |  |  |  |  |  |  |  |  |  |  |  |  |  |  |  |  |  |
| Aug-14 | 7.7 |  |  |  |  |  |  |  |  |  |  |  |  |  |  |  |  |  |  |  |  |  |  |  |  |  |  |  |  |  |  |  |  |  |  |  |  |  |  |  |  |  |  |  |  |  |  |  |  |  |  |
| Sep-14 | 7 |  |  |  |  |  |  |  |  |  |  |  |  |  |  |  |  |  |  |  |  |  |  |  |  |  |  |  |  |  |  |  |  |  |  |  |  |  |  |  |  |  |  |  |  |  |  |  |  |  |  |
| Oct-14 | 6.4 |  |  |  |  |  |  |  |  |  |  |  |  |  |  |  |  |  |  |  |  |  |  |  |  |  |  |  |  |  |  |  |  |  |  |  |  |  |  |  |  |  |  |  |  |  |  |  |  |  |  |
| Nov-14 | 7.5 |  |  |  |  |  |  |  |  |  |  |  |  |  |  |  |  |  |  |  |  |  |  |  |  |  |  |  |  |  |  |  |  |  |  |  |  |  |  |  |  |  |  |  |  |  |  |  |  |  |  |
| Dec-14 | 8.3 |  |  |  |  |  |  |  |  |  |  |  |  |  |  |  |  |  |  |  |  |  |  |  |  |  |  |  |  |  |  |  |  |  |  |  |  |  |  |  |  |  |  |  |  |  |  |  |  |  |  |
| Jan-15 | 9.8 |  |  |  |  |  |  |  |  |  |  |  |  |  |  |  |  |  |  |  |  |  |  |  |  |  |  |  |  |  |  |  |  |  |  |  |  |  |  |  |  |  |  |  |  |  |  |  |  |  |  |
| Feb-15 | 10.6 |  |  |  |  |  |  |  |  |  |  |  |  |  |  |  |  |  |  |  |  |  |  |  |  |  |  |  |  |  |  |  |  |  |  |  |  |  |  |  |  |  |  |  |  |  |  |  |  |  |  |
| Mar-15 | 9.5 |  |  |  |  |  |  |  |  |  |  |  |  |  |  |  |  |  |  |  |  |  |  |  |  |  |  |  |  |  |  |  |  |  |  |  |  |  |  |  |  |  |  |  |  |  |  |  |  |  |  |
| Apr-15 | 7.5 |  |  |  |  |  |  |  |  |  |  |  |  |  |  |  |  |  |  |  |  |  |  |  |  |  |  |  |  |  |  |  |  |  |  |  |  |  |  |  |  |  |  |  |  |  |  |  |  |  |  |
| May-15 | 6.7 |  |  |  |  |  |  |  |  |  |  |  |  |  |  |  |  |  |  |  |  |  |  |  |  |  |  |  |  |  |  |  |  |  |  |  |  |  |  |  |  |  |  |  |  |  |  |  |  |  |  |
| Jun-15 | 6.3 |  |  |  |  |  |  |  |  |  |  |  |  |  |  |  |  |  |  |  |  |  |  |  |  |  |  |  |  |  |  |  |  |  |  |  |  |  |  |  |  |  |  |  |  |  |  |  |  |  |  |
| Jul-15 | 5.5 |  |  |  |  |  |  |  |  |  |  |  |  |  |  |  |  |  |  |  |  |  |  |  |  |  |  |  |  |  |  |  |  |  |  |  |  |  |  |  |  |  |  |  |  |  |  |  |  |  |  |
| Aug-15 | 6.1 |  |  |  |  |  |  |  |  |  |  |  |  |  |  |  |  |  |  |  |  |  |  |  |  |  |  |  |  |  |  |  |  |  |  |  |  |  |  |  |  |  |  |  |  |  |  |  |  |  |  |
| Sep-15 | 5.5 |  |  |  |  |  |  |  |  |  |  |  |  |  |  |  |  |  |  |  |  |  |  |  |  |  |  |  |  |  |  |  |  |  |  |  |  |  |  |  |  |  |  |  |  |  |  |  |  |  |  |
| Oct-15 | 6.2 |  |  |  |  |  |  |  |  |  |  |  |  |  |  |  |  |  |  |  |  |  |  |  |  |  |  |  |  |  |  |  |  |  |  |  |  |  |  |  |  |  |  |  |  |  |  |  |  |  |  |
| Nov-15 | 6.2 |  |  |  |  |  |  |  |  |  |  |  |  |  |  |  |  |  |  |  |  |  |  |  |  |  |  |  |  |  |  |  |  |  |  |  |  |  |  |  |  |  |  |  |  |  |  |  |  |  |  |
| Dec-15 | 7.5 |  |  |  |  |  |  |  |  |  |  |  |  |  |  |  |  |  |  |  |  |  |  |  |  |  |  |  |  |  |  |  |  |  |  |  |  |  |  |  |  |  |  |  |  |  |  |  |  |  |  |
| Jan-16 | 8.5 |  |  |  |  |  |  |  |  |  |  |  |  |  |  |  |  |  |  |  |  |  |  |  |  |  |  |  |  |  |  |  |  |  |  |  |  |  |  |  |  |  |  |  |  |  |  |  |  |  |  |
| Feb-16 | 8.7 |  |  |  |  |  |  |  |  |  |  |  |  |  |  |  |  |  |  |  |  |  |  |  |  |  |  |  |  |  |  |  |  |  |  |  |  |  |  |  |  |  |  |  |  |  |  |  |  |  |  |
| Mar-16 | 8.7 |  |  |  |  |  |  |  |  |  |  |  |  |  |  |  |  |  |  |  |  |  |  |  |  |  |  |  |  |  |  |  |  |  |  |  |  |  |  |  |  |  |  |  |  |  |  |  |  |  |  |
| Apr-16 | 6 |  |  |  |  |  |  |  |  |  |  |  |  |  |  |  |  |  |  |  |  |  |  |  |  |  |  |  |  |  |  |  |  |  |  |  |  |  |  |  |  |  |  |  |  |  |  |  |  |  |  |
| May-16 | 5.2 |  |  |  |  |  |  |  |  |  |  |  |  |  |  |  |  |  |  |  |  |  |  |  |  |  |  |  |  |  |  |  |  |  |  |  |  |  |  |  |  |  |  |  |  |  |  |  |  |  |  |
| Jun-16 | 4.6 |  |  |  |  |  |  |  |  |  |  |  |  |  |  |  |  |  |  |  |  |  |  |  |  |  |  |  |  |  |  |  |  |  |  |  |  |  |  |  |  |  |  |  |  |  |  |  |  |  |  |
| Jul-16 | 4.5 |  |  |  |  |  |  |  |  |  |  |  |  |  |  |  |  |  |  |  |  |  |  |  |  |  |  |  |  |  |  |  |  |  |  |  |  |  |  |  |  |  |  |  |  |  |  |  |  |  |  |
| Aug-16 | 5.1 |  |  |  |  |  |  |  |  |  |  |  |  |  |  |  |  |  |  |  |  |  |  |  |  |  |  |  |  |  |  |  |  |  |  |  |  |  |  |  |  |  |  |  |  |  |  |  |  |  |  |
| Sep-16 | 5.2 |  |  |  |  |  |  |  |  |  |  |  |  |  |  |  |  |  |  |  |  |  |  |  |  |  |  |  |  |  |  |  |  |  |  |  |  |  |  |  |  |  |  |  |  |  |  |  |  |  |  |
| Oct-16 | 5.7 |  |  |  |  |  |  |  |  |  |  |  |  |  |  |  |  |  |  |  |  |  |  |  |  |  |  |  |  |  |  |  |  |  |  |  |  |  |  |  |  |  |  |  |  |  |  |  |  |  |  |
| Nov-16 | 5.7 |  |  |  |  |  |  |  |  |  |  |  |  |  |  |  |  |  |  |  |  |  |  |  |  |  |  |  |  |  |  |  |  |  |  |  |  |  |  |  |  |  |  |  |  |  |  |  |  |  |  |
| Dec-16 | 7.4 |  |  |  |  |  |  |  |  |  |  |  |  |  |  |  |  |  |  |  |  |  |  |  |  |  |  |  |  |  |  |  |  |  |  |  |  |  |  |  |  |  |  |  |  |  |  |  |  |  |  |
| Jan-17 | 9.4 |  |  |  |  |  |  |  |  |  |  |  |  |  |  |  |  |  |  |  |  |  |  |  |  |  |  |  |  |  |  |  |  |  |  |  |  |  |  |  |  |  |  |  |  |  |  |  |  |  |  |
| Feb-17 | 8.8 |  |  |  |  |  |  |  |  |  |  |  |  |  |  |  |  |  |  |  |  |  |  |  |  |  |  |  |  |  |  |  |  |  |  |  |  |  |  |  |  |  |  |  |  |  |  |  |  |  |  |
| Mar-17 | 8.4 |  |  |  |  |  |  |  |  |  |  |  |  |  |  |  |  |  |  |  |  |  |  |  |  |  |  |  |  |  |  |  |  |  |  |  |  |  |  |  |  |  |  |  |  |  |  |  |  |  |  |
| Apr-17 | 6.3 |  |  |  |  |  |  |  |  |  |  |  |  |  |  |  |  |  |  |  |  |  |  |  |  |  |  |  |  |  |  |  |  |  |  |  |  |  |  |  |  |  |  |  |  |  |  |  |  |  |  |
| May-17 | 5.3 |  |  |  |  |  |  |  |  |  |  |  |  |  |  |  |  |  |  |  |  |  |  |  |  |  |  |  |  |  |  |  |  |  |  |  |  |  |  |  |  |  |  |  |  |  |  |  |  |  |  |
| Jun-17 | 4.5 |  |  |  |  |  |  |  |  |  |  |  |  |  |  |  |  |  |  |  |  |  |  |  |  |  |  |  |  |  |  |  |  |  |  |  |  |  |  |  |  |  |  |  |  |  |  |  |  |  |  |
| Jul-17 | 4.9 |  |  |  |  |  |  |  |  |  |  |  |  |  |  |  |  |  |  |  |  |  |  |  |  |  |  |  |  |  |  |  |  |  |  |  |  |  |  |  |  |  |  |  |  |  |  |  |  |  |  |
| Aug-17 | 4.7 |  |  |  |  |  |  |  |  |  |  |  |  |  |  |  |  |  |  |  |  |  |  |  |  |  |  |  |  |  |  |  |  |  |  |  |  |  |  |  |  |  |  |  |  |  |  |  |  |  |  |
| Sep-17 | 4.7 |  |  |  |  |  |  |  |  |  |  |  |  |  |  |  |  |  |  |  |  |  |  |  |  |  |  |  |  |  |  |  |  |  |  |  |  |  |  |  |  |  |  |  |  |  |  |  |  |  |  |
| Oct-17 | 4.5 |  |  |  |  |  |  |  |  |  |  |  |  |  |  |  |  |  |  |  |  |  |  |  |  |  |  |  |  |  |  |  |  |  |  |  |  |  |  |  |  |  |  |  |  |  |  |  |  |  |  |
| Nov-17 | 5 |  |  |  |  |  |  |  |  |  |  |  |  |  |  |  |  |  |  |  |  |  |  |  |  |  |  |  |  |  |  |  |  |  |  |  |  |  |  |  |  |  |  |  |  |  |  |  |  |  |  |
| Dec-17 | 5.9 |  |  |  |  |  |  |  |  |  |  |  |  |  |  |  |  |  |  |  |  |  |  |  |  |  |  |  |  |  |  |  |  |  |  |  |  |  |  |  |  |  |  |  |  |  |  |  |  |  |  |
| Jan-18 | 7.3 |  |  |  |  |  |  |  |  |  |  |  |  |  |  |  |  |  |  |  |  |  |  |  |  |  |  |  |  |  |  |  |  |  |  |  |  |  |  |  |  |  |  |  |  |  |  |  |  |  |  |
| Feb-18 | 7.8 |  |  |  |  |  |  |  |  |  |  |  |  |  |  |  |  |  |  |  |  |  |  |  |  |  |  |  |  |  |  |  |  |  |  |  |  |  |  |  |  |  |  |  |  |  |  |  |  |  |  |
| Mar-18 | 7.4 |  |  |  |  |  |  |  |  |  |  |  |  |  |  |  |  |  |  |  |  |  |  |  |  |  |  |  |  |  |  |  |  |  |  |  |  |  |  |  |  |  |  |  |  |  |  |  |  |  |  |
| Apr-18 | 6.5 |  |  |  |  |  |  |  |  |  |  |  |  |  |  |  |  |  |  |  |  |  |  |  |  |  |  |  |  |  |  |  |  |  |  |  |  |  |  |  |  |  |  |  |  |  |  |  |  |  |  |
| May-18 | 4.4 |  |  |  |  |  |  |  |  |  |  |  |  |  |  |  |  |  |  |  |  |  |  |  |  |  |  |  |  |  |  |  |  |  |  |  |  |  |  |  |  |  |  |  |  |  |  |  |  |  |  |
| Jun-18 | 4.7 |  |  |  |  |  |  |  |  |  |  |  |  |  |  |  |  |  |  |  |  |  |  |  |  |  |  |  |  |  |  |  |  |  |  |  |  |  |  |  |  |  |  |  |  |  |  |  |  |  |  |
| Jul-18 | 3.4 |  |  |  |  |  |  |  |  |  |  |  |  |  |  |  |  |  |  |  |  |  |  |  |  |  |  |  |  |  |  |  |  |  |  |  |  |  |  |  |  |  |  |  |  |  |  |  |  |  |  |
| Aug-18 | 3.4 |  |  |  |  |  |  |  |  |  |  |  |  |  |  |  |  |  |  |  |  |  |  |  |  |  |  |  |  |  |  |  |  |  |  |  |  |  |  |  |  |  |  |  |  |  |  |  |  |  |  |
| Sep-18 | 4.1 |  |  |  |  |  |  |  |  |  |  |  |  |  |  |  |  |  |  |  |  |  |  |  |  |  |  |  |  |  |  |  |  |  |  |  |  |  |  |  |  |  |  |  |  |  |  |  |  |  |  |
| Oct-18 | 3.6 |  |  |  |  |  |  |  |  |  |  |  |  |  |  |  |  |  |  |  |  |  |  |  |  |  |  |  |  |  |  |  |  |  |  |  |  |  |  |  |  |  |  |  |  |  |  |  |  |  |  |
| Nov-18 | 3.9 |  |  |  |  |  |  |  |  |  |  |  |  |  |  |  |  |  |  |  |  |  |  |  |  |  |  |  |  |  |  |  |  |  |  |  |  |  |  |  |  |  |  |  |  |  |  |  |  |  |  |
| Dec-18 | 5.1 |  |  |  |  |  |  |  |  |  |  |  |  |  |  |  |  |  |  |  |  |  |  |  |  |  |  |  |  |  |  |  |  |  |  |  |  |  |  |  |  |  |  |  |  |  |  |  |  |  |  |
| Jan-19 | 6.4 |  |  |  |  |  |  |  |  |  |  |  |  |  |  |  |  |  |  |  |  |  |  |  |  |  |  |  |  |  |  |  |  |  |  |  |  |  |  |  |  |  |  |  |  |  |  |  |  |  |  |
| Feb-19 | 6.2 |  |  |  |  |  |  |  |  |  |  |  |  |  |  |  |  |  |  |  |  |  |  |  |  |  |  |  |  |  |  |  |  |  |  |  |  |  |  |  |  |  |  |  |  |  |  |  |  |  |  |
| Mar-19 | 5.2 |  |  |  |  |  |  |  |  |  |  |  |  |  |  |  |  |  |  |  |  |  |  |  |  |  |  |  |  |  |  |  |  |  |  |  |  |  |  |  |  |  |  |  |  |  |  |  |  |  |  |
| Apr-19 | 4.7 |  |  |  |  |  |  |  |  |  |  |  |  |  |  |  |  |  |  |  |  |  |  |  |  |  |  |  |  |  |  |  |  |  |  |  |  |  |  |  |  |  |  |  |  |  |  |  |  |  |  |
| May-19 | 3.2 |  |  |  |  |  |  |  |  |  |  |  |  |  |  |  |  |  |  |  |  |  |  |  |  |  |  |  |  |  |  |  |  |  |  |  |  |  |  |  |  |  |  |  |  |  |  |  |  |  |  |
| Jun-19 | 4 |  |  |  |  |  |  |  |  |  |  |  |  |  |  |  |  |  |  |  |  |  |  |  |  |  |  |  |  |  |  |  |  |  |  |  |  |  |  |  |  |  |  |  |  |  |  |  |  |  |  |
| Jul-19 | 3.8 |  |  |  |  |  |  |  |  |  |  |  |  |  |  |  |  |  |  |  |  |  |  |  |  |  |  |  |  |  |  |  |  |  |  |  |  |  |  |  |  |  |  |  |  |  |  |  |  |  |  |
| Aug-19 | 3.6 |  |  |  |  |  |  |  |  |  |  |  |  |  |  |  |  |  |  |  |  |  |  |  |  |  |  |  |  |  |  |  |  |  |  |  |  |  |  |  |  |  |  |  |  |  |  |  |  |  |  |
| Sep-19 | 3.2 |  |  |  |  |  |  |  |  |  |  |  |  |  |  |  |  |  |  |  |  |  |  |  |  |  |  |  |  |  |  |  |  |  |  |  |  |  |  |  |  |  |  |  |  |  |  |  |  |  |  |
| Oct-19 | 4 |  |  |  |  |  |  |  |  |  |  |  |  |  |  |  |  |  |  |  |  |  |  |  |  |  |  |  |  |  |  |  |  |  |  |  |  |  |  |  |  |  |  |  |  |  |  |  |  |  |  |
| Nov-19 | 4.4 |  |  |  |  |  |  |  |  |  |  |  |  |  |  |  |  |  |  |  |  |  |  |  |  |  |  |  |  |  |  |  |  |  |  |  |  |  |  |  |  |  |  |  |  |  |  |  |  |  |  |
| Dec-19 | 5 |  |  |  |  |  |  |  |  |  |  |  |  |  |  |  |  |  |  |  |  |  |  |  |  |  |  |  |  |  |  |  |  |  |  |  |  |  |  |  |  |  |  |  |  |  |  |  |  |  |  |
| Jan-20 | 5.4 |  |  |  |  |  |  |  |  |  |  |  |  |  |  |  |  |  |  |  |  |  |  |  |  |  |  |  |  |  |  |  |  |  |  |  |  |  |  |  |  |  |  |  |  |  |  |  |  |  |  |
| Feb-20 | 5.5 |  |  |  |  |  |  |  |  |  |  |  |  |  |  |  |  |  |  |  |  |  |  |  |  |  |  |  |  |  |  |  |  |  |  |  |  |  |  |  |  |  |  |  |  |  |  |  |  |  |  |
| Mar-20 | 6.9 |  |  |  |  |  |  |  |  |  |  |  |  |  |  |  |  |  |  |  |  |  |  |  |  |  |  |  |  |  |  |  |  |  |  |  |  |  |  |  |  |  |  |  |  |  |  |  |  |  |  |
| Apr-20 | 16.6 |  |  |  |  |  |  |  |  |  |  |  |  |  |  |  |  |  |  |  |  |  |  |  |  |  |  |  |  |  |  |  |  |  |  |  |  |  |  |  |  |  |  |  |  |  |  |  |  |  |  |
| May-20 | 12.7 |  |  |  |  |  |  |  |  |  |  |  |  |  |  |  |  |  |  |  |  |  |  |  |  |  |  |  |  |  |  |  |  |  |  |  |  |  |  |  |  |  |  |  |  |  |  |  |  |  |  |
| Jun-20 | 10.1 |  |  |  |  |  |  |  |  |  |  |  |  |  |  |  |  |  |  |  |  |  |  |  |  |  |  |  |  |  |  |  |  |  |  |  |  |  |  |  |  |  |  |  |  |  |  |  |  |  |  |
| Jul-20 | 8.9 |  |  |  |  |  |  |  |  |  |  |  |  |  |  |  |  |  |  |  |  |  |  |  |  |  |  |  |  |  |  |  |  |  |  |  |  |  |  |  |  |  |  |  |  |  |  |  |  |  |  |
| Aug-20 | 7.6 |  |  |  |  |  |  |  |  |  |  |  |  |  |  |  |  |  |  |  |  |  |  |  |  |  |  |  |  |  |  |  |  |  |  |  |  |  |  |  |  |  |  |  |  |  |  |  |  |  |  |
| Sep-20 | 7.1 |  |  |  |  |  |  |  |  |  |  |  |  |  |  |  |  |  |  |  |  |  |  |  |  |  |  |  |  |  |  |  |  |  |  |  |  |  |  |  |  |  |  |  |  |  |  |  |  |  |  |
| Oct-20 | 6.8 |  |  |  |  |  |  |  |  |  |  |  |  |  |  |  |  |  |  |  |  |  |  |  |  |  |  |  |  |  |  |  |  |  |  |  |  |  |  |  |  |  |  |  |  |  |  |  |  |  |  |
| Nov-20 | 7.3 |  |  |  |  |  |  |  |  |  |  |  |  |  |  |  |  |  |  |  |  |  |  |  |  |  |  |  |  |  |  |  |  |  |  |  |  |  |  |  |  |  |  |  |  |  |  |  |  |  |  |
| Dec-20 | 9.6 |  |  |  |  |  |  |  |  |  |  |  |  |  |  |  |  |  |  |  |  |  |  |  |  |  |  |  |  |  |  |  |  |  |  |  |  |  |  |  |  |  |  |  |  |  |  |  |  |  |  |
| Jan-21 | 9.4 |  |  |  |  |  |  |  |  |  |  |  |  |  |  |  |  |  |  |  |  |  |  |  |  |  |  |  |  |  |  |  |  |  |  |  |  |  |  |  |  |  |  |  |  |  |  |  |  |  |  |
| Feb-21 | 9.6 |  |  |  |  |  |  |  |  |  |  |  |  |  |  |  |  |  |  |  |  |  |  |  |  |  |  |  |  |  |  |  |  |  |  |  |  |  |  |  |  |  |  |  |  |  |  |  |  |  |  |
| Mar-21 | 8.6 |  |  |  |  |  |  |  |  |  |  |  |  |  |  |  |  |  |  |  |  |  |  |  |  |  |  |  |  |  |  |  |  |  |  |  |  |  |  |  |  |  |  |  |  |  |  |  |  |  |  |
| Apr-21 | 7.7 |  |  |  |  |  |  |  |  |  |  |  |  |  |  |  |  |  |  |  |  |  |  |  |  |  |  |  |  |  |  |  |  |  |  |  |  |  |  |  |  |  |  |  |  |  |  |  |  |  |  |
| May-21 | 6.7 |  |  |  |  |  |  |  |  |  |  |  |  |  |  |  |  |  |  |  |  |  |  |  |  |  |  |  |  |  |  |  |  |  |  |  |  |  |  |  |  |  |  |  |  |  |  |  |  |  |  |
| Jun-21 | 7.5 |  |  |  |  |  |  |  |  |  |  |  |  |  |  |  |  |  |  |  |  |  |  |  |  |  |  |  |  |  |  |  |  |  |  |  |  |  |  |  |  |  |  |  |  |  |  |  |  |  |  |
| Jul-21 | 6.1 |  |  |  |  |  |  |  |  |  |  |  |  |  |  |  |  |  |  |  |  |  |  |  |  |  |  |  |  |  |  |  |  |  |  |  |  |  |  |  |  |  |  |  |  |  |  |  |  |  |  |
| Aug-21 | 4.6 |  |  |  |  |  |  |  |  |  |  |  |  |  |  |  |  |  |  |  |  |  |  |  |  |  |  |  |  |  |  |  |  |  |  |  |  |  |  |  |  |  |  |  |  |  |  |  |  |  |  |
| Sep-21 | 4.5 |  |  |  |  |  |  |  |  |  |  |  |  |  |  |  |  |  |  |  |  |  |  |  |  |  |  |  |  |  |  |  |  |  |  |  |  |  |  |  |  |  |  |  |  |  |  |  |  |  |  |